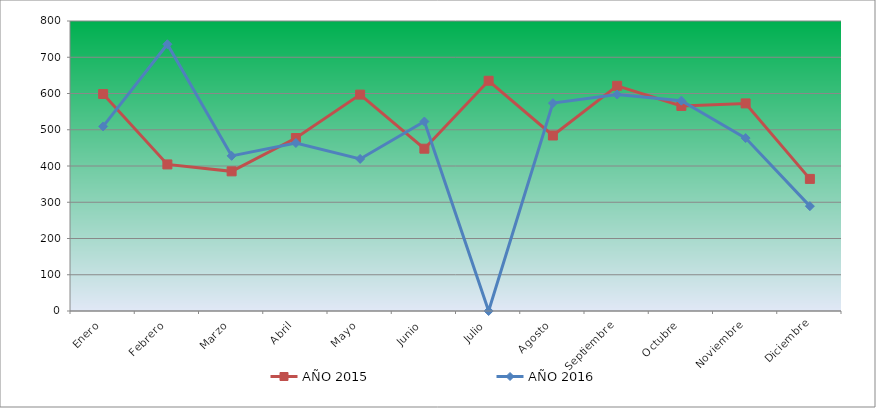
| Category | AÑO 2015 | AÑO 2016 |
|---|---|---|
| Enero | 598.704 | 509.16 |
| Febrero | 404.342 | 735.829 |
| Marzo | 385.253 | 427.965 |
| Abril | 477.228 | 463.487 |
| Mayo | 596.968 | 419.507 |
| Junio | 447.726 | 522.692 |
| Julio | 635.147 | 0 |
| Agosto | 484.169 | 573.439 |
| Septiembre | 621.264 | 597.121 |
| Octubre | 565.732 | 580.205 |
| Noviembre | 572.673 | 477.02 |
| Diciembre | 364.428 | 289.257 |